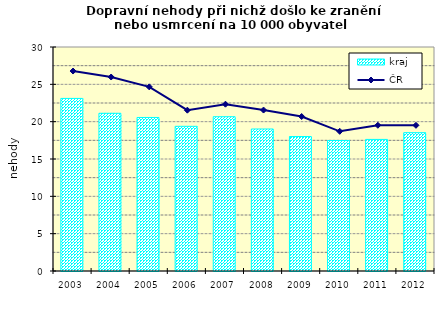
| Category | kraj |
|---|---|
| 2003.0 | 23.113 |
| 2004.0 | 21.123 |
| 2005.0 | 20.561 |
| 2006.0 | 19.377 |
| 2007.0 | 20.661 |
| 2008.0 | 19.016 |
| 2009.0 | 18.011 |
| 2010.0 | 17.478 |
| 2011.0 | 17.622 |
| 2012.0 | 18.528 |